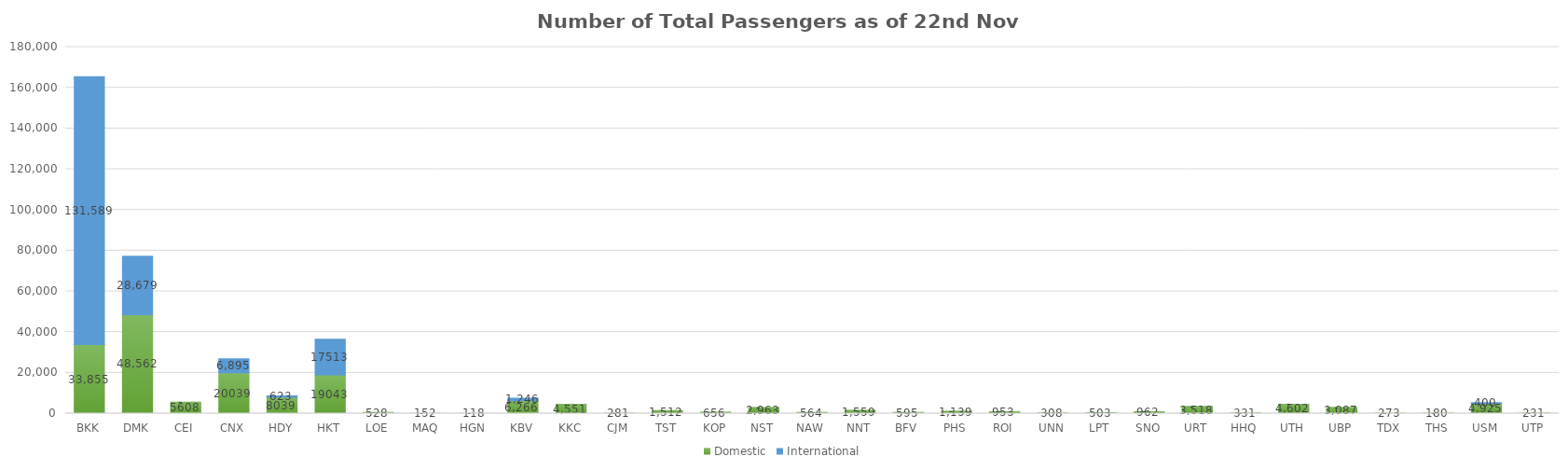
| Category | Domestic | International |
|---|---|---|
| BKK | 33855 | 131589 |
| DMK | 48562 | 28679 |
| CEI | 5608 | 0 |
| CNX | 20039 | 6895 |
| HDY | 8039 | 623 |
| HKT | 19043 | 17513 |
| LOE | 528 | 0 |
| MAQ | 152 | 0 |
| HGN | 118 | 0 |
| KBV | 6266 | 1246 |
| KKC | 4551 | 0 |
| CJM | 281 | 0 |
| TST | 1512 | 0 |
| KOP | 656 | 0 |
| NST | 2963 | 0 |
| NAW | 564 | 0 |
| NNT | 1559 | 0 |
| BFV | 595 | 0 |
| PHS | 1139 | 0 |
| ROI | 953 | 0 |
| UNN | 308 | 0 |
| LPT | 503 | 0 |
| SNO | 962 | 0 |
| URT | 3518 | 0 |
| HHQ | 331 | 0 |
| UTH | 4602 | 0 |
| UBP | 3087 | 0 |
| TDX | 273 | 0 |
| THS | 180 | 0 |
| USM | 4925 | 400 |
| UTP | 231 | 0 |